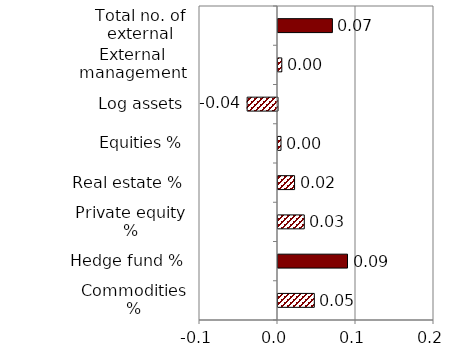
| Category | Series 0 |
|---|---|
| Commodities % | 0.047 |
| Hedge fund % | 0.089 |
| Private equity % | 0.034 |
| Real estate % | 0.021 |
| Equities % | 0.004 |
| Log assets | -0.039 |
| External management only | 0.005 |
| Total no. of external managers | 0.07 |